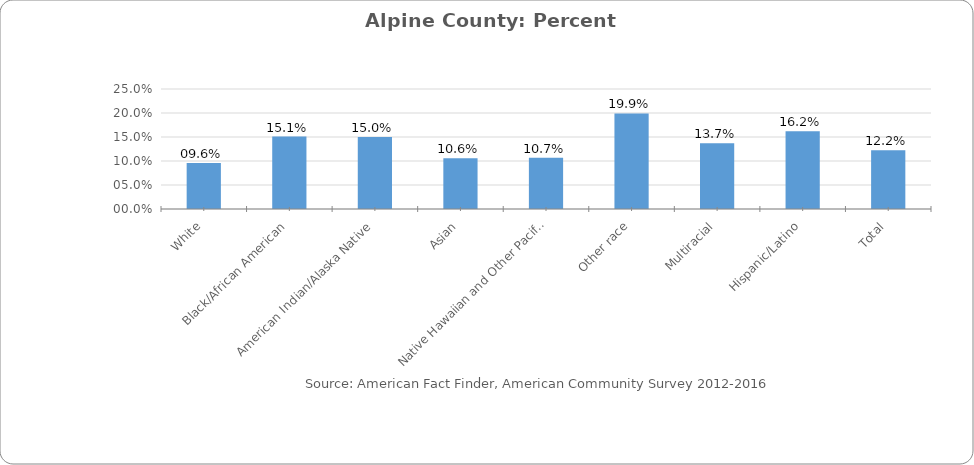
| Category | Percent Population below Poverty Level in Sonoma County |
|---|---|
| White | 0.096 |
| Black/African American | 0.151 |
| American Indian/Alaska Native | 0.15 |
| Asian | 0.106 |
|  Native Hawaiian and Other Pacific Islander | 0.107 |
| Other race | 0.199 |
| Multiracial | 0.137 |
| Hispanic/Latino | 0.162 |
| Total | 0.122 |